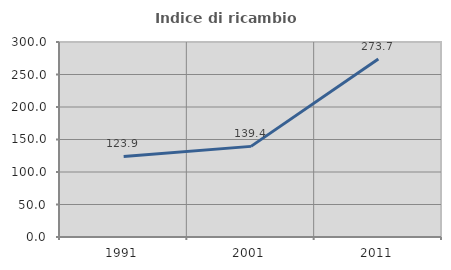
| Category | Indice di ricambio occupazionale  |
|---|---|
| 1991.0 | 123.855 |
| 2001.0 | 139.429 |
| 2011.0 | 273.729 |